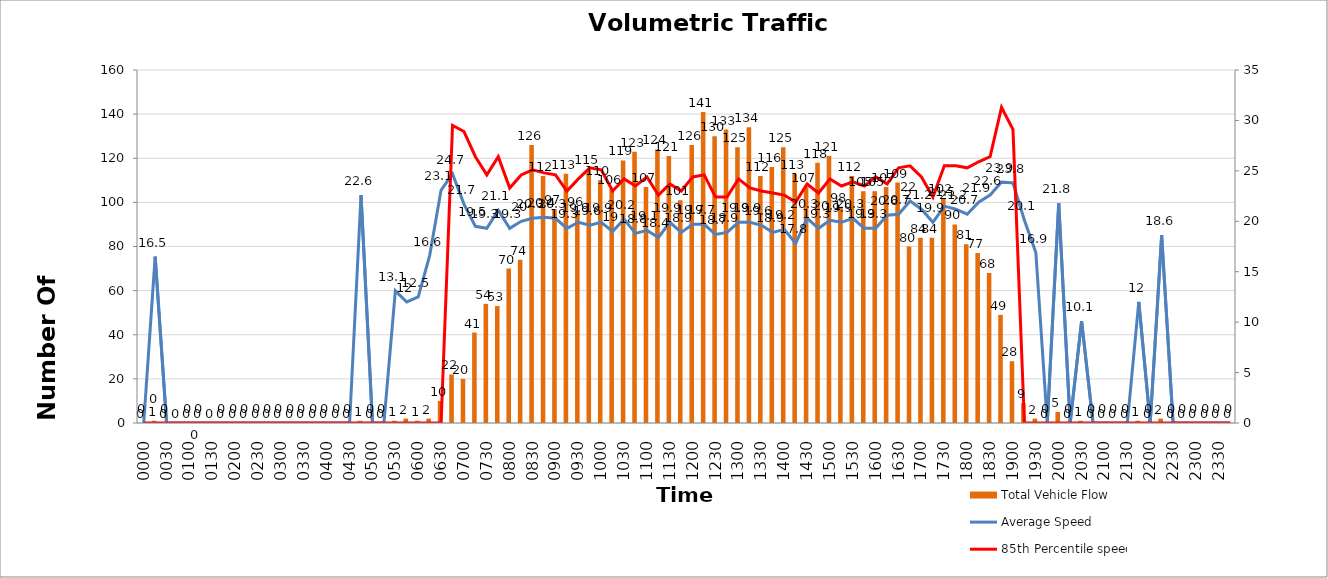
| Category | Total Vehicle Flow |
|---|---|
| 0000 | 0 |
| 0015 | 1 |
| 0030 | 0 |
| 0045 | 0 |
| 0100 | 0 |
| 0115 | 0 |
| 0130 | 0 |
| 0145 | 0 |
| 0200 | 0 |
| 0215 | 0 |
| 0230 | 0 |
| 0245 | 0 |
| 0300 | 0 |
| 0315 | 0 |
| 0330 | 0 |
| 0345 | 0 |
| 0400 | 0 |
| 0415 | 0 |
| 0430 | 0 |
| 0445 | 1 |
| 0500 | 0 |
| 0515 | 0 |
| 0530 | 1 |
| 0545 | 2 |
| 0600 | 1 |
| 0615 | 2 |
| 0630 | 10 |
| 0645 | 22 |
| 0700 | 20 |
| 0715 | 41 |
| 0730 | 54 |
| 0745 | 53 |
| 0800 | 70 |
| 0815 | 74 |
| 0830 | 126 |
| 0845 | 112 |
| 0900 | 97 |
| 0915 | 113 |
| 0930 | 96 |
| 0945 | 115 |
| 1000 | 110 |
| 1015 | 106 |
| 1030 | 119 |
| 1045 | 123 |
| 1100 | 107 |
| 1115 | 124 |
| 1130 | 121 |
| 1145 | 101 |
| 1200 | 126 |
| 1215 | 141 |
| 1230 | 130 |
| 1245 | 133 |
| 1300 | 125 |
| 1315 | 134 |
| 1330 | 112 |
| 1345 | 116 |
| 1400 | 125 |
| 1415 | 113 |
| 1430 | 107 |
| 1445 | 118 |
| 1500 | 121 |
| 1515 | 98 |
| 1530 | 112 |
| 1545 | 105 |
| 1600 | 105 |
| 1615 | 107 |
| 1630 | 109 |
| 1645 | 80 |
| 1700 | 84 |
| 1715 | 84 |
| 1730 | 102 |
| 1745 | 90 |
| 1800 | 81 |
| 1815 | 77 |
| 1830 | 68 |
| 1845 | 49 |
| 1900 | 28 |
| 1915 | 9 |
| 1930 | 2 |
| 1945 | 0 |
| 2000 | 5 |
| 2015 | 0 |
| 2030 | 1 |
| 2045 | 0 |
| 2100 | 0 |
| 2115 | 0 |
| 2130 | 0 |
| 2145 | 1 |
| 2200 | 0 |
| 2215 | 2 |
| 2230 | 0 |
| 2245 | 0 |
| 2300 | 0 |
| 2315 | 0 |
| 2330 | 0 |
| 2345 | 0 |